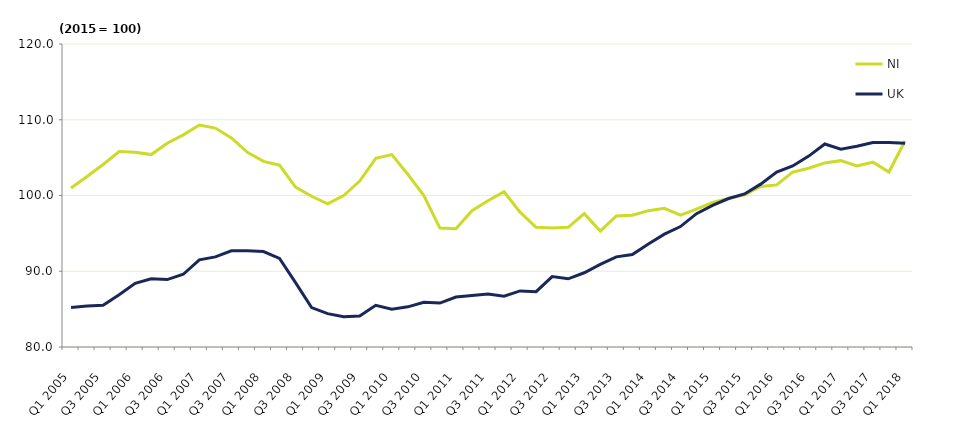
| Category | NI  | UK  |
|---|---|---|
| Q1 2005 | 101 | 85.2 |
| Q2 2005 | 102.5 | 85.4 |
| Q3 2005 | 104.1 | 85.5 |
| Q4 2005 | 105.8 | 86.9 |
| Q1 2006 | 105.7 | 88.4 |
| Q2 2006 | 105.4 | 89 |
| Q3 2006 | 106.9 | 88.9 |
| Q4 2006 | 108 | 89.6 |
| Q1 2007 | 109.3 | 91.5 |
| Q2 2007 | 108.9 | 91.9 |
| Q3 2007 | 107.6 | 92.7 |
| Q4 2007 | 105.7 | 92.7 |
| Q1 2008 | 104.5 | 92.6 |
| Q2 2008 | 104 | 91.7 |
| Q3 2008 | 101.1 | 88.5 |
| Q4 2008 | 99.9 | 85.2 |
| Q1 2009 | 98.9 | 84.4 |
| Q2 2009 | 100 | 84 |
| Q3 2009 | 101.9 | 84.1 |
| Q4 2009 | 104.9 | 85.5 |
| Q1 2010 | 105.4 | 85 |
| Q2 2010 | 102.8 | 85.3 |
| Q3 2010 | 100 | 85.9 |
| Q4 2010 | 95.7 | 85.8 |
| Q1 2011 | 95.6 | 86.6 |
| Q2 2011 | 98 | 86.8 |
| Q3 2011 | 99.3 | 87 |
| Q4 2011 | 100.5 | 86.7 |
| Q1 2012 | 97.8 | 87.4 |
| Q2 2012 | 95.8 | 87.3 |
| Q3 2012 | 95.7 | 89.3 |
| Q4 2012 | 95.8 | 89 |
| Q1 2013 | 97.6 | 89.8 |
| Q2 2013 | 95.3 | 90.9 |
| Q3 2013 | 97.3 | 91.9 |
| Q4 2013 | 97.4 | 92.2 |
| Q1 2014 | 98 | 93.6 |
| Q2 2014 | 98.3 | 94.9 |
| Q3 2014 | 97.4 | 95.9 |
| Q4 2014 | 98.2 | 97.6 |
| Q1 2015 | 99.1 | 98.7 |
| Q2 2015 | 99.6 | 99.6 |
| Q3 2015 | 100.1 | 100.2 |
| Q4 2015 | 101.2 | 101.5 |
| Q1 2016 | 101.4 | 103.1 |
| Q2 2016 | 103.1 | 103.9 |
| Q3 2016 | 103.6 | 105.2 |
| Q4 2016 | 104.3 | 106.8 |
| Q1 2017 | 104.6 | 106.1 |
| Q2 2017 | 103.9 | 106.5 |
| Q3 2017 | 104.4 | 107 |
| Q4 2017 | 103.1 | 107 |
| Q1 2018 | 107.2 | 106.9 |